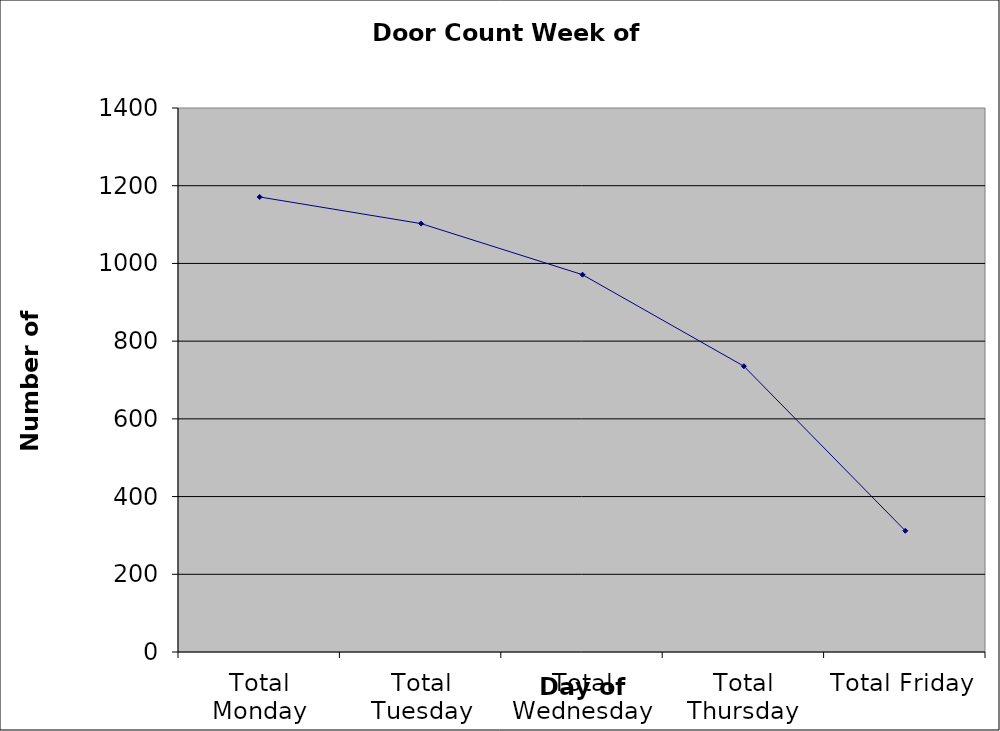
| Category | Series 0 |
|---|---|
| Total Monday | 1171 |
| Total Tuesday | 1102.5 |
| Total Wednesday | 971 |
| Total Thursday | 735.5 |
| Total Friday | 312 |